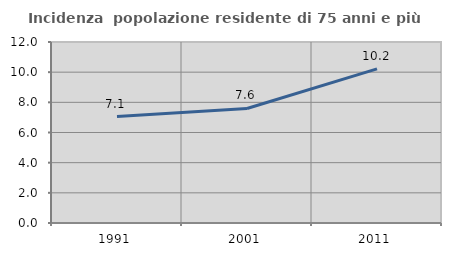
| Category | Incidenza  popolazione residente di 75 anni e più |
|---|---|
| 1991.0 | 7.06 |
| 2001.0 | 7.594 |
| 2011.0 | 10.223 |